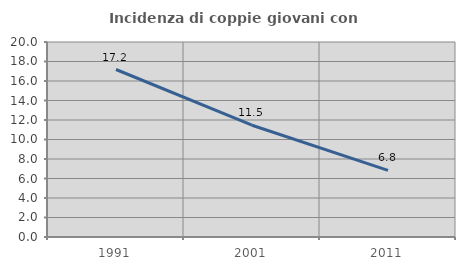
| Category | Incidenza di coppie giovani con figli |
|---|---|
| 1991.0 | 17.179 |
| 2001.0 | 11.463 |
| 2011.0 | 6.841 |